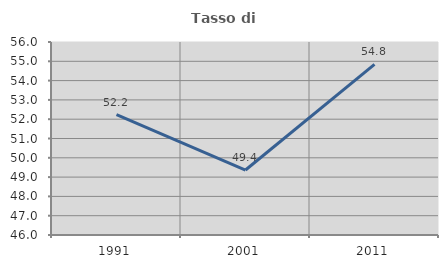
| Category | Tasso di occupazione   |
|---|---|
| 1991.0 | 52.242 |
| 2001.0 | 49.367 |
| 2011.0 | 54.839 |